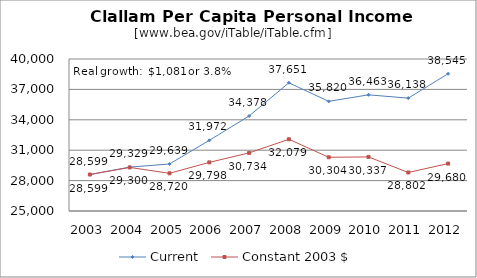
| Category | Current | Constant 2003 $ |
|---|---|---|
| 2003 | 28599 | 28599 |
| 2004 | 29329 | 29299.671 |
| 2005 | 29639 | 28720.191 |
| 2006 | 31972 | 29797.904 |
| 2007 | 34378 | 30733.932 |
| 2008 | 37651 | 32078.652 |
| 2009 | 35820 | 30303.72 |
| 2010 | 36463 | 30337.216 |
| 2011 | 36138 | 28801.986 |
| 2012 | 38545 | 29679.65 |